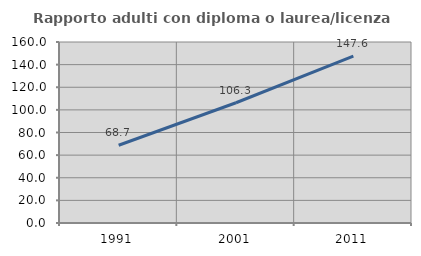
| Category | Rapporto adulti con diploma o laurea/licenza media  |
|---|---|
| 1991.0 | 68.701 |
| 2001.0 | 106.303 |
| 2011.0 | 147.565 |